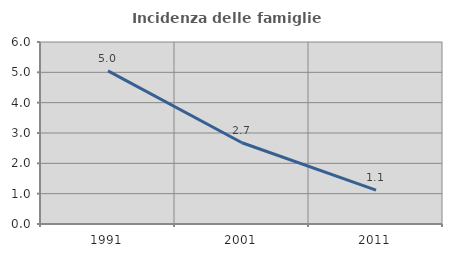
| Category | Incidenza delle famiglie numerose |
|---|---|
| 1991.0 | 5.049 |
| 2001.0 | 2.679 |
| 2011.0 | 1.114 |